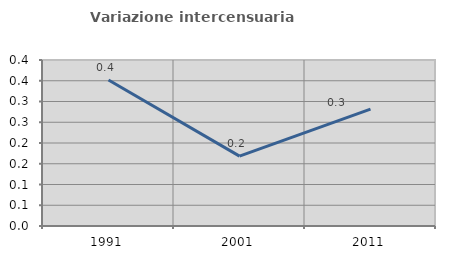
| Category | Variazione intercensuaria annua |
|---|---|
| 1991.0 | 0.352 |
| 2001.0 | 0.168 |
| 2011.0 | 0.282 |